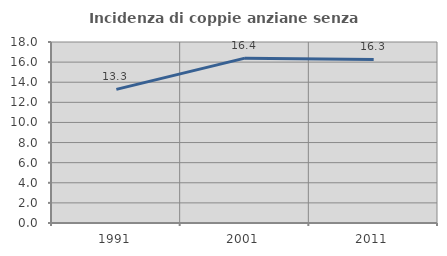
| Category | Incidenza di coppie anziane senza figli  |
|---|---|
| 1991.0 | 13.291 |
| 2001.0 | 16.395 |
| 2011.0 | 16.267 |